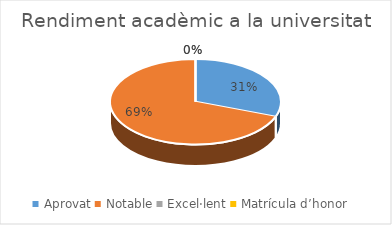
| Category | Series 0 |
|---|---|
| Aprovat | 23 |
| Notable | 52 |
| Excel·lent | 0 |
| Matrícula d’honor | 0 |